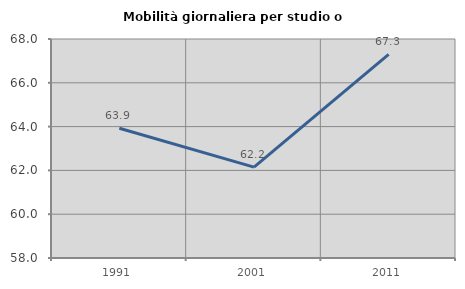
| Category | Mobilità giornaliera per studio o lavoro |
|---|---|
| 1991.0 | 63.925 |
| 2001.0 | 62.152 |
| 2011.0 | 67.295 |